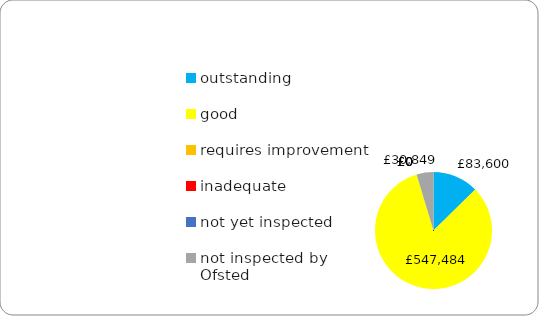
| Category | Series 0 |
|---|---|
| outstanding | 83600 |
| good | 547483.8 |
| requires improvement | 0 |
| inadequate | 0 |
| not yet inspected | 0 |
| not inspected by Ofsted | 30849 |